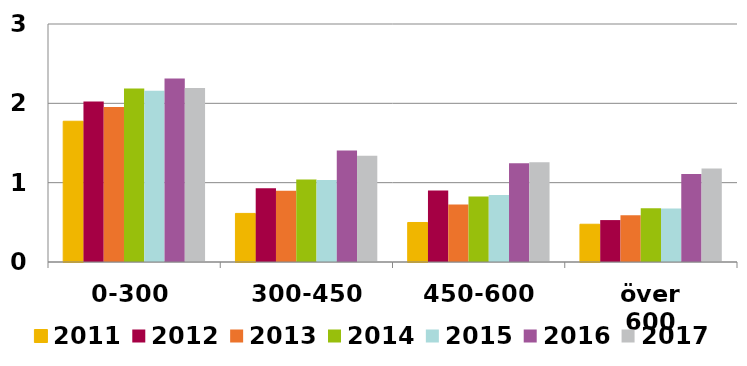
| Category | 2011 | 2012 | 2013 | 2014 | 2015 | 2016 | 2017 |
|---|---|---|---|---|---|---|---|
| 0-300 | 1.774 | 2.024 | 1.953 | 2.188 | 2.157 | 2.314 | 2.193 |
| 300-450 | 0.612 | 0.928 | 0.899 | 1.038 | 1.033 | 1.406 | 1.339 |
| 450-600 | 0.498 | 0.903 | 0.725 | 0.826 | 0.844 | 1.245 | 1.259 |
| över 600 | 0.476 | 0.528 | 0.59 | 0.678 | 0.674 | 1.11 | 1.178 |